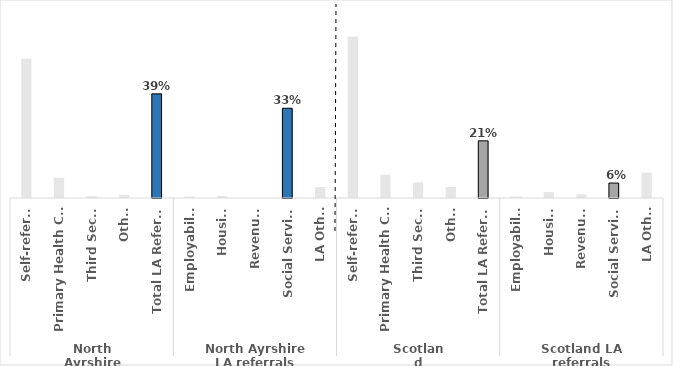
| Category | Series 0 |
|---|---|
| 0 | 0.519 |
| 1 | 0.076 |
| 2 | 0.006 |
| 3 | 0.012 |
| 4 | 0.388 |
| 5 | 0.005 |
| 6 | 0.008 |
| 7 | 0 |
| 8 | 0.334 |
| 9 | 0.041 |
| 10 | 0.601 |
| 11 | 0.087 |
| 12 | 0.058 |
| 13 | 0.041 |
| 14 | 0.213 |
| 15 | 0.006 |
| 16 | 0.022 |
| 17 | 0.014 |
| 18 | 0.056 |
| 19 | 0.095 |